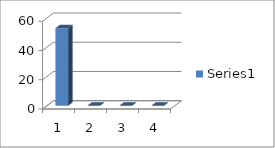
| Category | Series 0 |
|---|---|
| 0 | 53 |
| 1 | 0 |
| 2 | 0 |
| 3 | 0 |